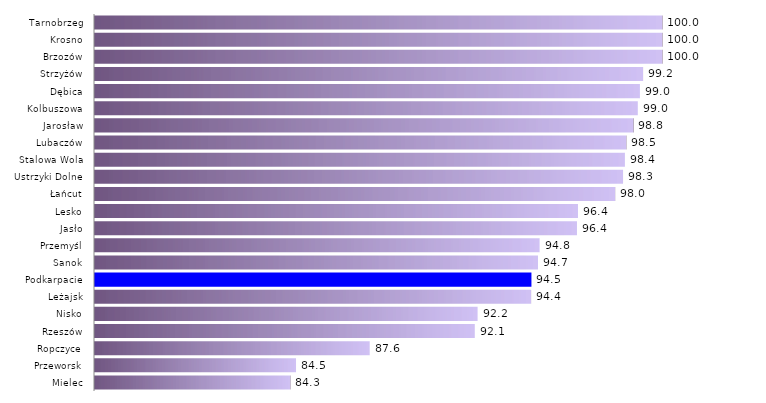
| Category | a |
|---|---|
| Mielec | 84.264 |
| Przeworsk | 84.502 |
| Ropczyce | 87.619 |
| Rzeszów | 92.063 |
| Nisko | 92.182 |
| Leżajsk | 94.444 |
| Podkarpacie | 94.459 |
| Sanok | 94.737 |
| Przemyśl | 94.805 |
| Jasło | 96.386 |
| Lesko | 96.429 |
| Łańcut | 98 |
| Ustrzyki Dolne | 98.333 |
| Stalowa Wola | 98.413 |
| Lubaczów | 98.473 |
| Jarosław | 98.776 |
| Kolbuszowa | 98.958 |
| Dębica | 99.048 |
| Strzyżów | 99.18 |
| Brzozów | 100 |
| Krosno | 100 |
| Tarnobrzeg | 100 |